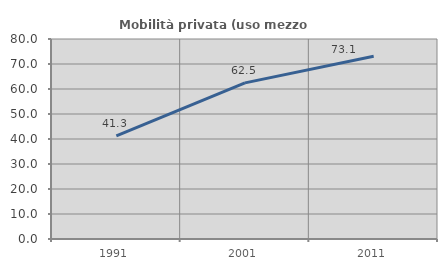
| Category | Mobilità privata (uso mezzo privato) |
|---|---|
| 1991.0 | 41.292 |
| 2001.0 | 62.458 |
| 2011.0 | 73.081 |